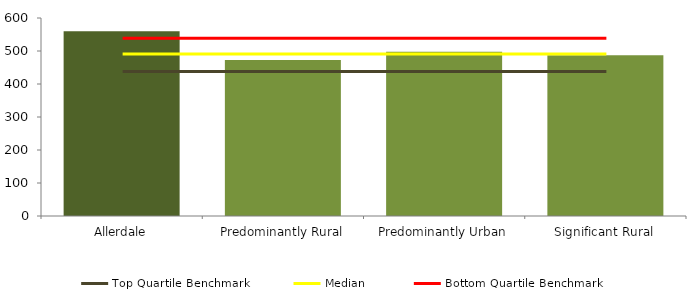
| Category | Series 0 |
|---|---|
| Allerdale | 560.1 |
| Predominantly Rural | 472.83 |
| Predominantly Urban | 497.78 |
| Significant Rural | 487.253 |